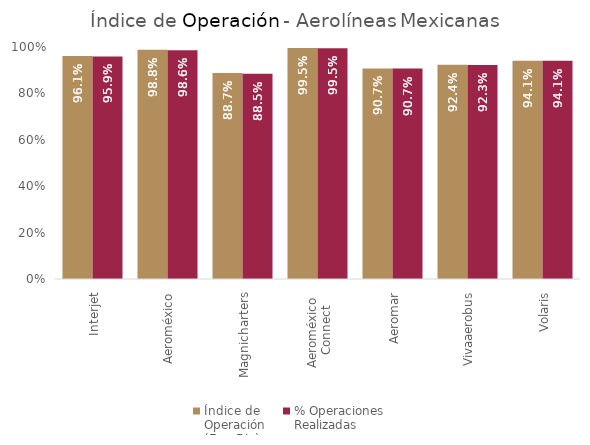
| Category | Índice de 
Operación
(Ene-Dic) | % Operaciones
Realizadas |
|---|---|---|
| Interjet | 0.961 | 0.959 |
| Aeroméxico | 0.988 | 0.986 |
| Magnicharters | 0.887 | 0.885 |
| Aeroméxico 
Connect | 0.995 | 0.995 |
| Aeromar | 0.907 | 0.907 |
| Vivaaerobus | 0.924 | 0.923 |
| Volaris | 0.941 | 0.941 |